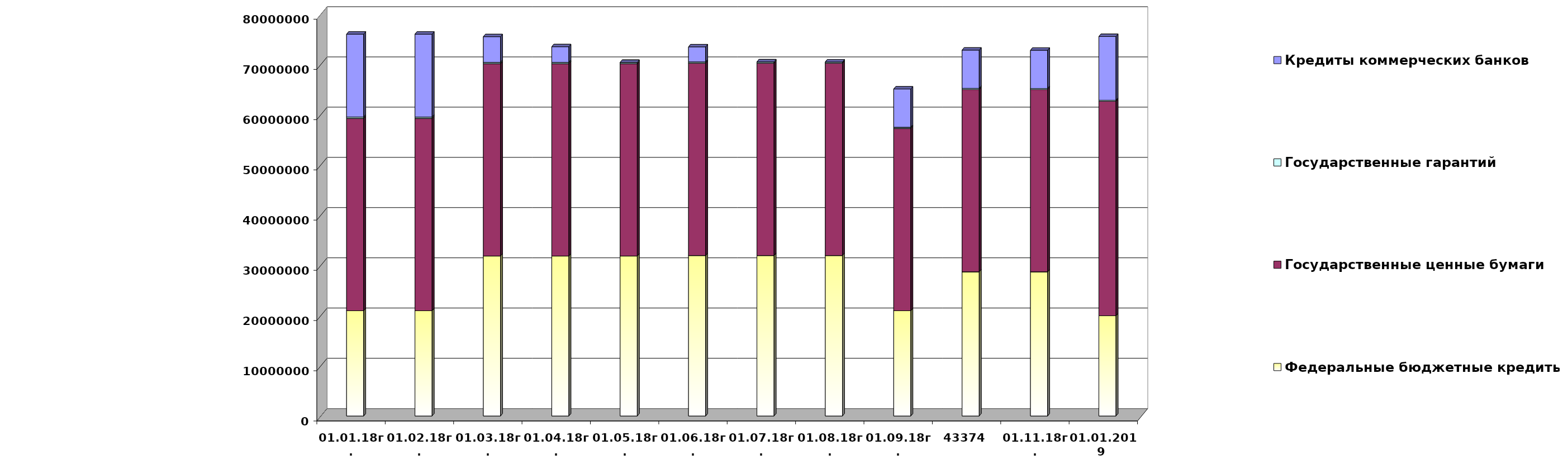
| Category | Федеральные бюджетные кредиты | Государственные ценные бумаги  | Государственные гарантий | Кредиты коммерческих банков |
|---|---|---|---|---|
| 01.01.18г. | 20959084.963 | 38300000 | 267412.82 | 16500000 |
| 01.02.18г. | 20959084.963 | 38300000 | 262100.52 | 16500000 |
| 01.03.18г. | 31846902.963 | 38300000 | 262100.52 | 5112182 |
| 01.04.18г. | 31846902.963 | 38300000 | 262100.52 | 3112182 |
| 01.05.18г. | 31846902.963 | 38300000 | 253223.16 | 0 |
| 01.06.18г. | 31945227.963 | 38300000 | 253223.16 | 3000000 |
| 01.07.18г. | 31945227.963 | 38300000 | 253223.16 | 0 |
| 01.08.18г. | 31945227.963 | 38300000 | 232477.01 | 0 |
| 01.09.18г. | 20959084.963 | 36300000 | 232477.01 | 7612182 |
| 43374 | 28702553.563 | 36300000 | 232477.01 | 7612182 |
| 01.11.18г. | 28702553.563 | 36300000 | 209872.86 | 7612182 |
| 01.01.2019 
(прогноз) | 19957026.2 | 42700000 | 209872.8 | 12690101.4 |